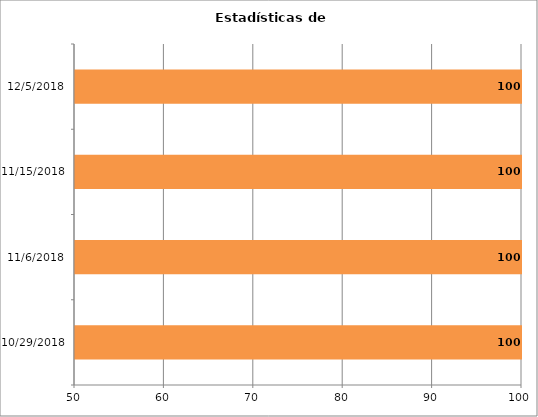
| Category | Series 0 |
|---|---|
| 10/29/18 | 100 |
| 11/6/18 | 100 |
| 11/15/18 | 100 |
| 12/5/18 | 100 |